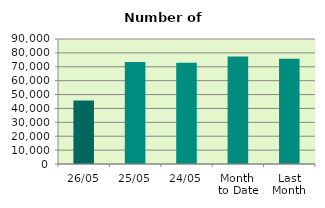
| Category | Series 0 |
|---|---|
| 26/05 | 45674 |
| 25/05 | 73494 |
| 24/05 | 72956 |
| Month 
to Date | 77317.889 |
| Last
Month | 75814.526 |